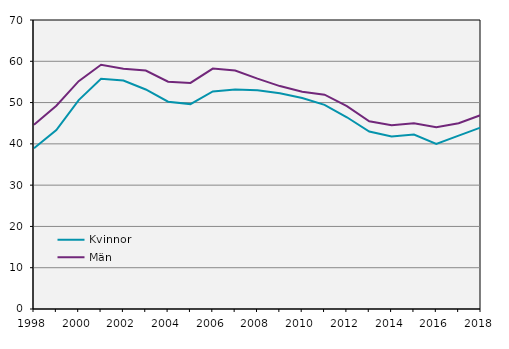
| Category | Kvinnor | Män |
|---|---|---|
| 1998.0 | 38.925 | 44.655 |
| 1999.0 | 43.325 | 49.244 |
| 2000.0 | 50.59 | 55.19 |
| 2001.0 | 55.758 | 59.15 |
| 2002.0 | 55.326 | 58.186 |
| 2003.0 | 53.17 | 57.758 |
| 2004.0 | 50.207 | 55.064 |
| 2005.0 | 49.629 | 54.759 |
| 2006.0 | 52.687 | 58.225 |
| 2007.0 | 53.163 | 57.779 |
| 2008.0 | 53.002 | 55.787 |
| 2009.0 | 52.267 | 53.994 |
| 2010.0 | 51.126 | 52.615 |
| 2011.0 | 49.444 | 51.908 |
| 2012.0 | 46.442 | 49.139 |
| 2013.0 | 42.982 | 45.47 |
| 2014.0 | 41.785 | 44.488 |
| 2015.0 | 42.268 | 44.996 |
| 2016.0 | 40 | 44 |
| 2017.0 | 42 | 45 |
| 2018.0 | 44 | 47 |